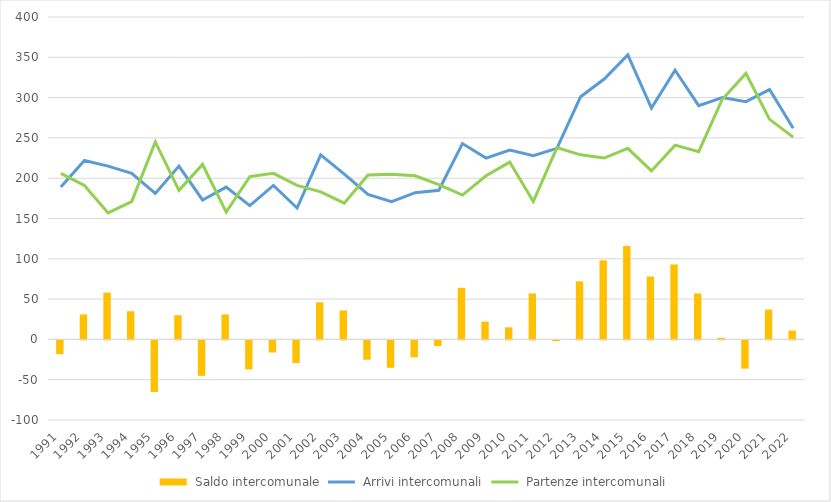
| Category |  Saldo intercomunale |
|---|---|
| 1991 | -17 |
| 1992 | 31 |
| 1993 | 58 |
| 1994 | 35 |
| 1995 | -64 |
| 1996 | 30 |
| 1997 | -44 |
| 1998 | 31 |
| 1999 | -36 |
| 2000 | -15 |
| 2001 | -28 |
| 2002 | 46 |
| 2003 | 36 |
| 2004 | -24 |
| 2005 | -34 |
| 2006 | -21 |
| 2007 | -7 |
| 2008 | 64 |
| 2009 | 22 |
| 2010 | 15 |
| 2011 | 57 |
| 2012 | -1 |
| 2013 | 72 |
| 2014 | 98 |
| 2015 | 116 |
| 2016 | 78 |
| 2017 | 93 |
| 2018 | 57 |
| 2019 | 2 |
| 2020 | -35 |
| 2021 | 37 |
| 2022 | 11 |